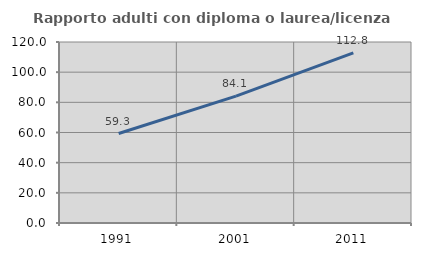
| Category | Rapporto adulti con diploma o laurea/licenza media  |
|---|---|
| 1991.0 | 59.307 |
| 2001.0 | 84.146 |
| 2011.0 | 112.843 |